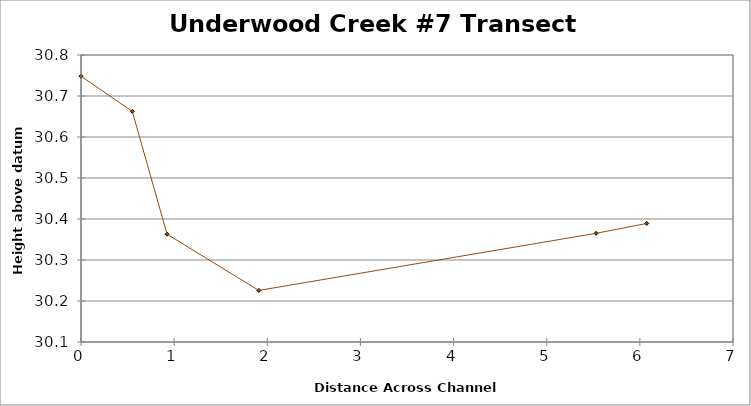
| Category | Series 0 |
|---|---|
| 0.0 | 30.748 |
| 0.5508727733622455 | 30.663 |
| 0.9237148934957005 | 30.363 |
| 1.909083965728353 | 30.226 |
| 5.529927163349025 | 30.365 |
| 6.0735054812988505 | 30.389 |